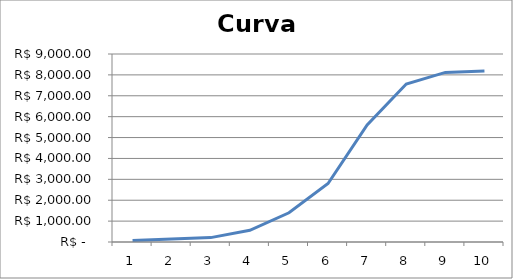
| Category | Acumulado |
|---|---|
| 0 | 70 |
| 1 | 140 |
| 2 | 210 |
| 3 | 560 |
| 4 | 1400 |
| 5 | 2800 |
| 6 | 5600 |
| 7 | 7560 |
| 8 | 8120 |
| 9 | 8190 |